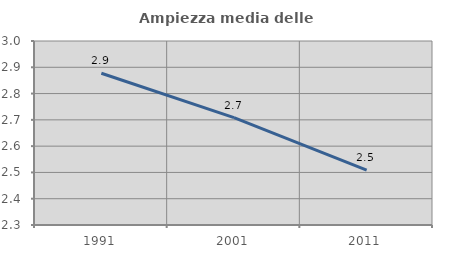
| Category | Ampiezza media delle famiglie |
|---|---|
| 1991.0 | 2.877 |
| 2001.0 | 2.708 |
| 2011.0 | 2.509 |